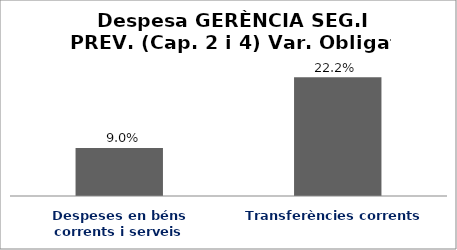
| Category | Series 0 |
|---|---|
| Despeses en béns corrents i serveis | 0.09 |
| Transferències corrents | 0.222 |